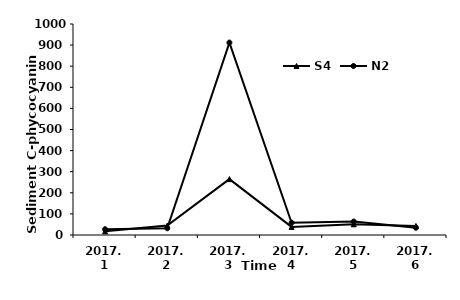
| Category | S4 | N2 |
|---|---|---|
| 2017.1 | 17.398 | 27.365 |
| 2017.2 | 44.978 | 31.958 |
| 2017.3 | 264.925 | 911.929 |
| 2017.4 | 38.319 | 58.249 |
| 2017.5 | 50.674 | 63.79 |
| 2017.6 | 42.779 | 34.451 |